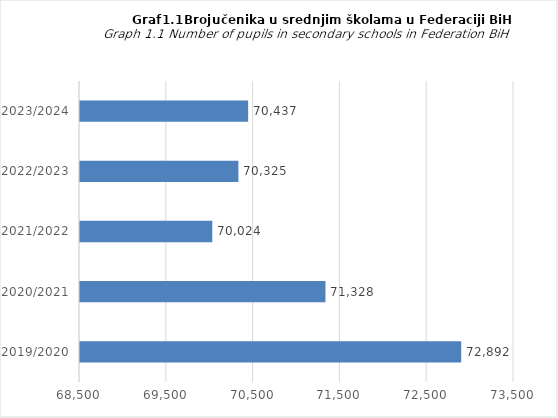
| Category | Series 0 |
|---|---|
| 2019/2020 | 72892 |
| 2020/2021 | 71328 |
| 2021/2022 | 70024 |
| 2022/2023 | 70325 |
| 2023/2024 | 70437 |